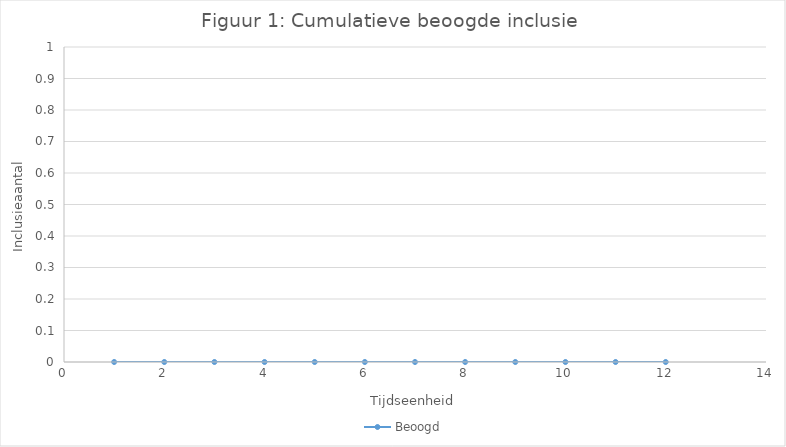
| Category | Beoogd |
|---|---|
| 0 | 0 |
| 1 | 0 |
| 2 | 0 |
| 3 | 0 |
| 4 | 0 |
| 5 | 0 |
| 6 | 0 |
| 7 | 0 |
| 8 | 0 |
| 9 | 0 |
| 10 | 0 |
| 11 | 0 |